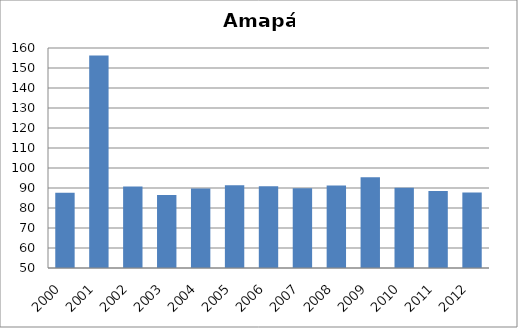
| Category | Hepatite B |
|---|---|
| 2000.0 | 87.62 |
| 2001.0 | 156.27 |
| 2002.0 | 90.72 |
| 2003.0 | 86.5 |
| 2004.0 | 89.8 |
| 2005.0 | 91.32 |
| 2006.0 | 90.84 |
| 2007.0 | 89.91 |
| 2008.0 | 91.22 |
| 2009.0 | 95.34 |
| 2010.0 | 90.14 |
| 2011.0 | 88.48 |
| 2012.0 | 87.77 |